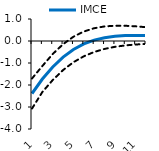
| Category | Series 0 | IMCE | Series 2 |
|---|---|---|---|
| 1.0 | -1.705 | -2.388 | -3.071 |
| 2.0 | -1.137 | -1.728 | -2.319 |
| 3.0 | -0.592 | -1.184 | -1.775 |
| 4.0 | -0.145 | -0.733 | -1.322 |
| 5.0 | 0.195 | -0.385 | -0.964 |
| 6.0 | 0.431 | -0.132 | -0.695 |
| 7.0 | 0.58 | 0.041 | -0.499 |
| 8.0 | 0.662 | 0.151 | -0.36 |
| 9.0 | 0.694 | 0.215 | -0.265 |
| 10.0 | 0.692 | 0.246 | -0.201 |
| 11.0 | 0.667 | 0.254 | -0.159 |
| 12.0 | 0.628 | 0.247 | -0.133 |